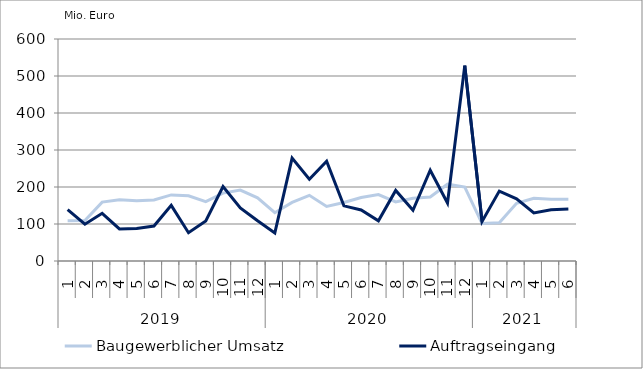
| Category | Baugewerblicher Umsatz | Auftragseingang |
|---|---|---|
| 0 | 108616.605 | 139065.287 |
| 1 | 109331.58 | 99318.609 |
| 2 | 159117.81 | 129002.041 |
| 3 | 165654.287 | 86579.2 |
| 4 | 162976.056 | 87644.362 |
| 5 | 165026.188 | 94463.186 |
| 6 | 178622.938 | 150345.08 |
| 7 | 176074.101 | 76434.317 |
| 8 | 160663.041 | 108444.162 |
| 9 | 183589.485 | 201122.697 |
| 10 | 191777.213 | 143514.792 |
| 11 | 170885.223 | 108780.022 |
| 12 | 130445.562 | 75891.481 |
| 13 | 158433.655 | 277923.85 |
| 14 | 177529.832 | 220973.626 |
| 15 | 147259.799 | 269936.091 |
| 16 | 157965.891 | 149072.895 |
| 17 | 171647.778 | 137984.76 |
| 18 | 179530.732 | 108645.965 |
| 19 | 159480.457 | 190771.468 |
| 20 | 169638.111 | 136988.906 |
| 21 | 173040.053 | 245341.603 |
| 22 | 207619.085 | 156647.224 |
| 23 | 199947.086 | 528166.004 |
| 24 | 101295.895 | 106850.127 |
| 25 | 103236.543 | 188883.434 |
| 26 | 156172.725 | 168204.42 |
| 27 | 169257.088 | 130052.073 |
| 28 | 166897.821 | 138492.214 |
| 29 | 166720.216 | 140262.426 |